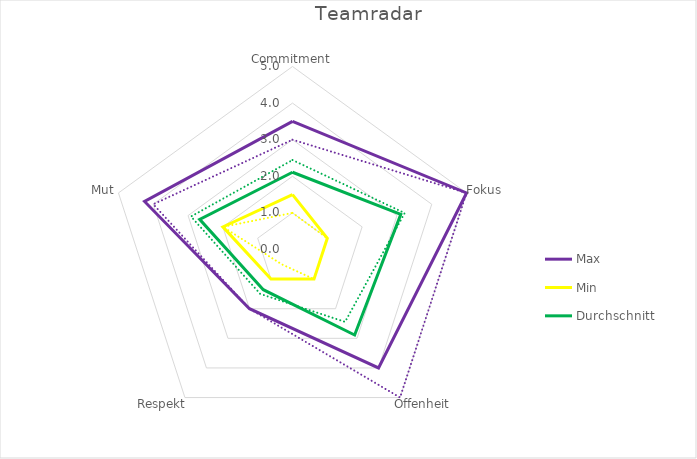
| Category | Durchschnitt | Max | Min |
|---|---|---|---|
| Commitment | 2.111 | 3 | 1 |
| Fokus | 3.111 | 5 | 1 |
| Offenheit | 2.889 | 5 | 1 |
| Respekt | 1.357 | 2 | 0.5 |
| Mut | 2.667 | 4 | 2 |